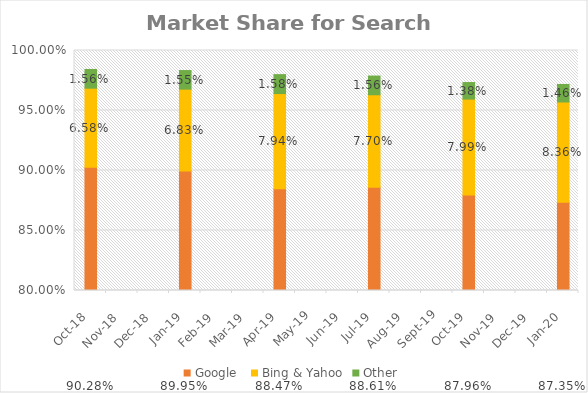
| Category | Google  | Bing & Yahoo | Other |
|---|---|---|---|
| 2018-10-01 | 0.903 | 0.066 | 0.016 |
| 2019-01-01 | 0.9 | 0.068 | 0.016 |
| 2019-04-01 | 0.885 | 0.079 | 0.016 |
| 2019-07-01 | 0.886 | 0.077 | 0.016 |
| 2019-10-01 | 0.88 | 0.08 | 0.014 |
| 2020-01-01 | 0.874 | 0.084 | 0.015 |